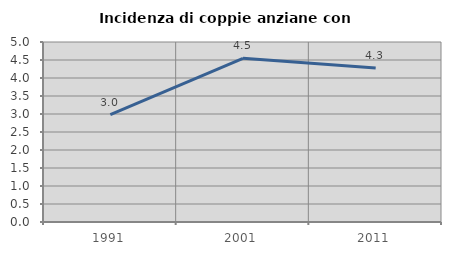
| Category | Incidenza di coppie anziane con figli |
|---|---|
| 1991.0 | 2.982 |
| 2001.0 | 4.545 |
| 2011.0 | 4.281 |